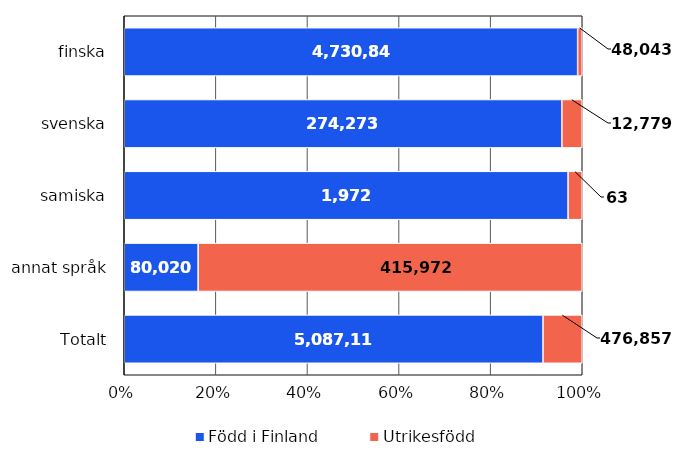
| Category | Född i Finland | Utrikesfödd |
|---|---|---|
| finska | 4730848 | 48043 |
| svenska | 274273 | 12779 |
| samiska | 1972 | 63 |
| annat språk | 80020 | 415972 |
| Totalt | 5087113 | 476857 |